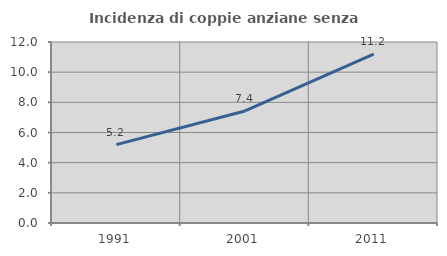
| Category | Incidenza di coppie anziane senza figli  |
|---|---|
| 1991.0 | 5.195 |
| 2001.0 | 7.428 |
| 2011.0 | 11.19 |